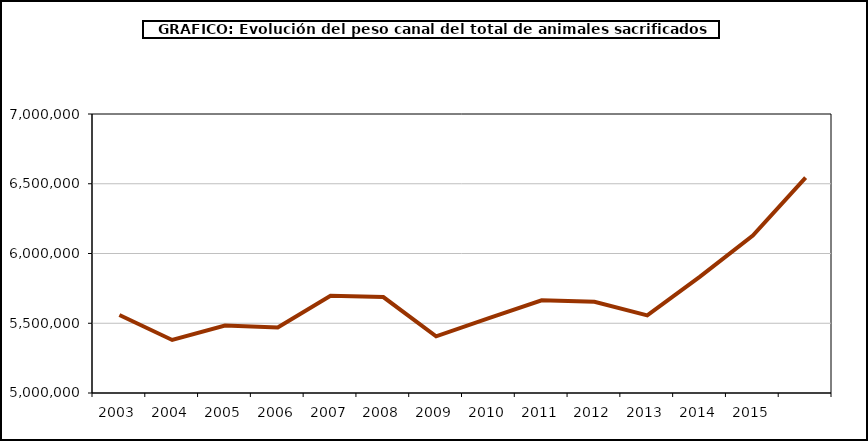
| Category | Series 0 |
|---|---|
| 2003.0 | 5559491.635 |
| 2004.0 | 5380320.91 |
| 2005.0 | 5484133.682 |
| 2006.0 | 5469928.516 |
| 2007.0 | 5697170.115 |
| 2008.0 | 5687912.363 |
| 2009.0 | 5406476.675 |
| 2010.0 | 5537415.454 |
| 2011.0 | 5664197.217 |
| 2012.0 | 5653769.803 |
| 2013.0 | 5556795.031 |
| 2014.0 | 5833789.68 |
| 2015.0 | 6129137.234 |